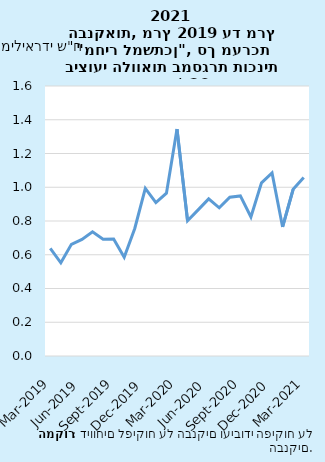
| Category | Series 0 |
|---|---|
| 2019-03-31 | 0.638 |
| 2019-04-30 | 0.552 |
| 2019-05-31 | 0.662 |
| 2019-06-30 | 0.691 |
| 2019-07-31 | 0.736 |
| 2019-08-31 | 0.692 |
| 2019-09-30 | 0.694 |
| 2019-10-31 | 0.585 |
| 2019-11-30 | 0.756 |
| 2019-12-31 | 0.994 |
| 2020-01-31 | 0.909 |
| 2020-02-29 | 0.965 |
| 2020-03-31 | 1.345 |
| 2020-04-30 | 0.801 |
| 2020-05-31 | 0.866 |
| 2020-06-30 | 0.931 |
| 2020-07-31 | 0.878 |
| 2020-08-31 | 0.941 |
| 2020-09-30 | 0.949 |
| 2020-10-31 | 0.824 |
| 2020-11-30 | 1.026 |
| 2020-12-31 | 1.085 |
| 2021-01-31 | 0.765 |
| 2021-02-28 | 0.988 |
| 2021-03-31 | 1.058 |